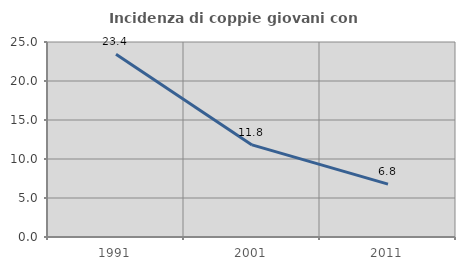
| Category | Incidenza di coppie giovani con figli |
|---|---|
| 1991.0 | 23.42 |
| 2001.0 | 11.808 |
| 2011.0 | 6.773 |